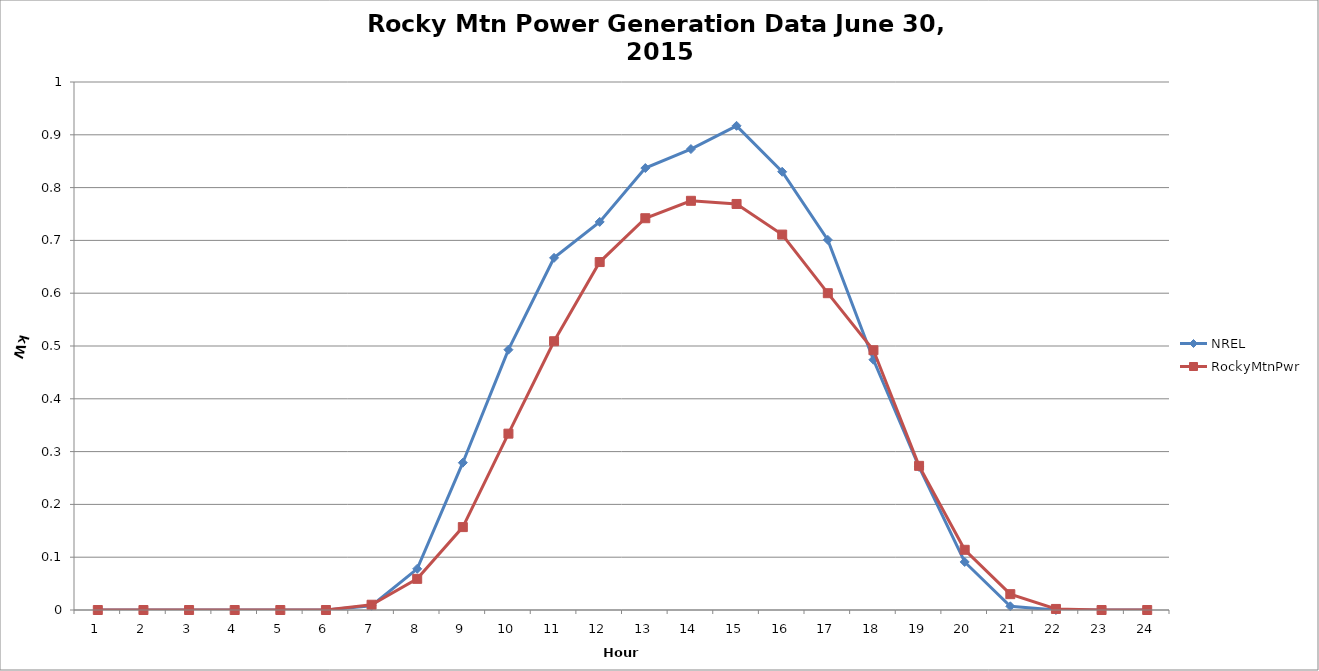
| Category | NREL | RockyMtnPwr |
|---|---|---|
| 0 | 0 | 0 |
| 1 | 0 | 0 |
| 2 | 0 | 0 |
| 3 | 0 | 0 |
| 4 | 0 | 0 |
| 5 | 0 | 0 |
| 6 | 0.008 | 0.01 |
| 7 | 0.078 | 0.059 |
| 8 | 0.279 | 0.157 |
| 9 | 0.493 | 0.334 |
| 10 | 0.667 | 0.509 |
| 11 | 0.735 | 0.659 |
| 12 | 0.837 | 0.742 |
| 13 | 0.873 | 0.775 |
| 14 | 0.917 | 0.769 |
| 15 | 0.83 | 0.711 |
| 16 | 0.701 | 0.6 |
| 17 | 0.474 | 0.492 |
| 18 | 0.271 | 0.273 |
| 19 | 0.091 | 0.114 |
| 20 | 0.007 | 0.03 |
| 21 | 0 | 0.002 |
| 22 | 0 | 0 |
| 23 | 0 | 0 |